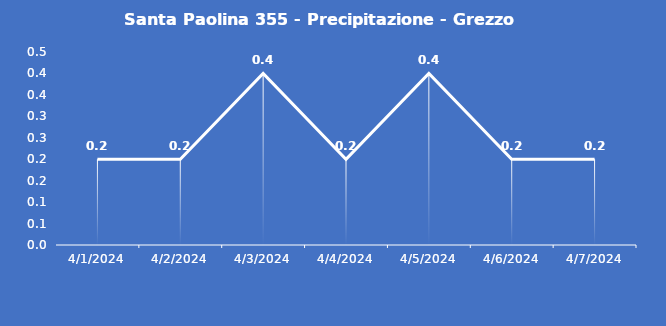
| Category | Santa Paolina 355 - Precipitazione - Grezzo (mm) |
|---|---|
| 4/1/24 | 0.2 |
| 4/2/24 | 0.2 |
| 4/3/24 | 0.4 |
| 4/4/24 | 0.2 |
| 4/5/24 | 0.4 |
| 4/6/24 | 0.2 |
| 4/7/24 | 0.2 |